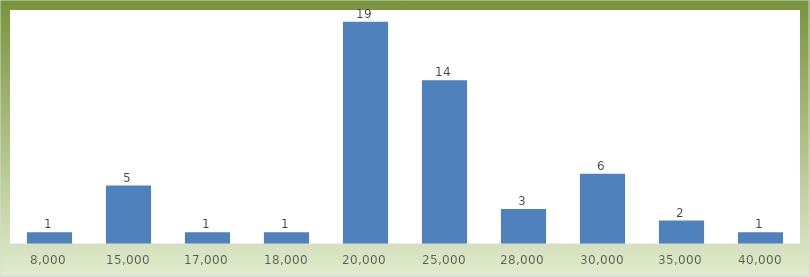
| Category | Series 0 |
|---|---|
| 8000.0 | 1 |
| 15000.0 | 5 |
| 17000.0 | 1 |
| 18000.0 | 1 |
| 20000.0 | 19 |
| 25000.0 | 14 |
| 28000.0 | 3 |
| 30000.0 | 6 |
| 35000.0 | 2 |
| 40000.0 | 1 |